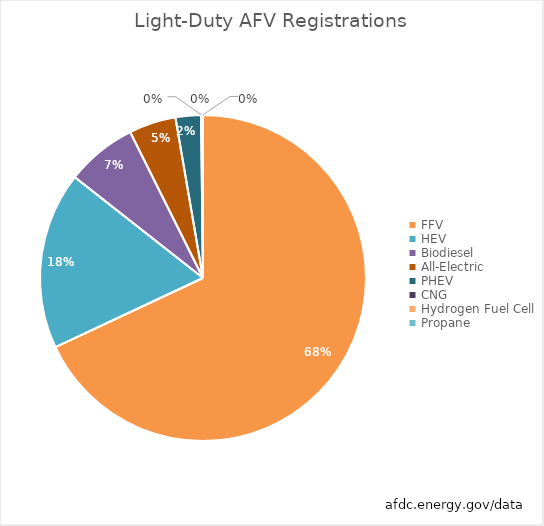
| Category | Series 0 |
|---|---|
| FFV | 21244600 |
| HEV | 5491700 |
| Biodiesel | 2193900 |
| All-Electric | 1454500 |
| PHEV | 786700 |
| CNG | 40600 |
| Hydrogen Fuel Cell | 12000 |
| Propane | 7400 |